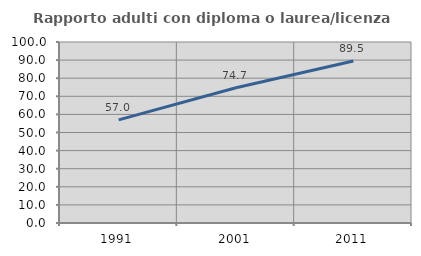
| Category | Rapporto adulti con diploma o laurea/licenza media  |
|---|---|
| 1991.0 | 56.95 |
| 2001.0 | 74.711 |
| 2011.0 | 89.458 |